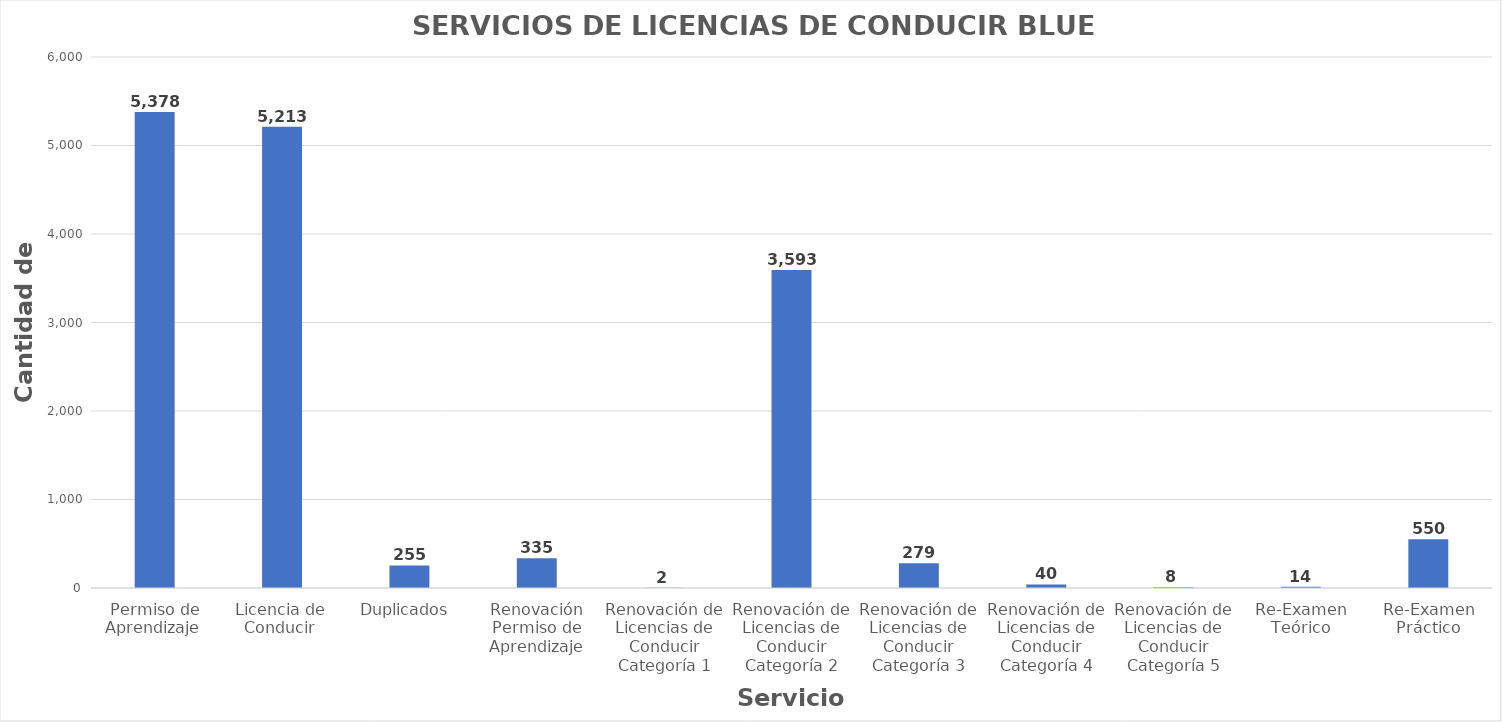
| Category | Series 0 |
|---|---|
| Permiso de Aprendizaje  | 5378 |
| Licencia de  Conducir  | 5213 |
| Duplicados  | 255 |
| Renovación Permiso de Aprendizaje | 335 |
| Renovación de Licencias de Conducir Categoría 1 | 2 |
| Renovación de Licencias de Conducir Categoría 2 | 3593 |
| Renovación de Licencias de Conducir Categoría 3 | 279 |
| Renovación de Licencias de Conducir Categoría 4 | 40 |
| Renovación de Licencias de Conducir Categoría 5 | 8 |
| Re-Examen Teórico | 14 |
| Re-Examen Práctico | 550 |